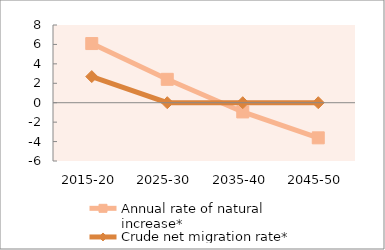
| Category | Annual rate of natural increase* | Crude net migration rate* |
|---|---|---|
| 2015-20 | 6.09 | 2.69 |
| 2025-30 | 2.409 | 0 |
| 2035-40 | -0.949 | 0 |
| 2045-50 | -3.616 | 0 |